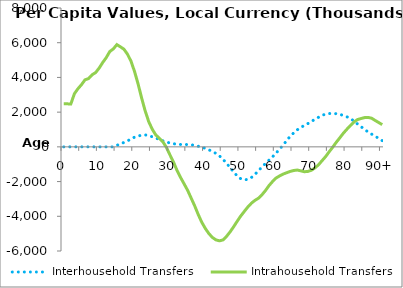
| Category | Interhousehold Transfers | Intrahousehold Transfers |
|---|---|---|
| 0 | 0 | 2479371.096 |
|  | 0 | 2476924.844 |
| 2 | 0 | 2473630.571 |
| 3 | 0 | 3059998.738 |
| 4 | 0 | 3347573.43 |
| 5 | 0 | 3581527.793 |
| 6 | 0 | 3860391.77 |
| 7 | 0 | 3932846.867 |
| 8 | 0 | 4151466.657 |
| 9 | 0 | 4279761.916 |
| 10 | 0 | 4538148.607 |
| 11 | 0 | 4857187.572 |
| 12 | 0 | 5139541.848 |
| 13 | 0 | 5490617.365 |
| 14 | 0 | 5643492.881 |
| 15 | 90722.41 | 5890176.488 |
| 16 | 160031.551 | 5763782.123 |
| 17 | 256141.92 | 5625981.125 |
| 18 | 343565.933 | 5340204.562 |
| 19 | 454004.797 | 4934194.831 |
| 20 | 558199.87 | 4341520.92 |
| 21 | 625277.721 | 3627402.817 |
| 22 | 670243.825 | 2819150.428 |
| 23 | 687757.653 | 2073214.287 |
| 24 | 649062.646 | 1456328.778 |
| 25 | 579011.338 | 1017542.77 |
| 26 | 506995.549 | 687680.511 |
| 27 | 428730.367 | 493853.991 |
| 28 | 346428.437 | 293736.442 |
| 29 | 276178.917 | -27857.112 |
| 30 | 223622.768 | -459732.258 |
| 31 | 183681.689 | -873627.657 |
| 32 | 145596.92 | -1354377.956 |
| 33 | 137260.264 | -1760097.844 |
| 34 | 141946.732 | -2129116.284 |
| 35 | 130977.022 | -2504586.74 |
| 36 | 119996.736 | -2950421.203 |
| 37 | 86779.723 | -3398948.605 |
| 38 | 33605.527 | -3897787.901 |
| 39 | -21348.29 | -4344660.185 |
| 40 | -82244.205 | -4701464.815 |
| 41 | -173182.72 | -4993687.088 |
| 42 | -262587.609 | -5219484.433 |
| 43 | -378758.688 | -5358471.869 |
| 44 | -521438.64 | -5413482.034 |
| 45 | -712932.328 | -5361709.464 |
| 46 | -945438.832 | -5156148.295 |
| 47 | -1198250.839 | -4900251.585 |
| 48 | -1439984.107 | -4604875.756 |
| 49 | -1677449.298 | -4290417.512 |
| 50 | -1835423.324 | -3988854.659 |
| 51 | -1900651.95 | -3725248.982 |
| 52 | -1876556.556 | -3468060.534 |
| 53 | -1769989.435 | -3252394.115 |
| 54 | -1594654.682 | -3086246.503 |
| 55 | -1373167.314 | -2961110.241 |
| 56 | -1165918.022 | -2763679.176 |
| 57 | -954459.582 | -2517441.599 |
| 58 | -764901.728 | -2232616.909 |
| 59 | -572245.251 | -1997121.369 |
| 60 | -359548.039 | -1795087.083 |
| 61 | -128782.19 | -1673602.28 |
| 62 | 103921.174 | -1568079.946 |
| 63 | 362268.079 | -1490838.893 |
| 64 | 612503.394 | -1414209.186 |
| 65 | 806135.709 | -1361427.947 |
| 66 | 983896.707 | -1335517.212 |
| 67 | 1125630.429 | -1382194.005 |
| 68 | 1230890.669 | -1431995.941 |
| 69 | 1339742.779 | -1416479.729 |
| 70 | 1474317.58 | -1346218.858 |
| 71 | 1582623.448 | -1209230.797 |
| 72 | 1705542.836 | -1032224.85 |
| 73 | 1814198.052 | -795490.214 |
| 74 | 1888725.597 | -563235.814 |
| 75 | 1919221.276 | -285043.551 |
| 76 | 1925051.255 | -20250.18 |
| 77 | 1910517.333 | 259960.118 |
| 78 | 1873719.177 | 517806.901 |
| 79 | 1811066.683 | 783171.76 |
| 80 | 1734508.62 | 1011949.483 |
| 81 | 1636691.938 | 1230990.202 |
| 82 | 1485730.496 | 1428632.86 |
| 83 | 1319682.925 | 1570821.828 |
| 84 | 1165583.254 | 1631695.439 |
| 85 | 1005396.4 | 1685480.809 |
| 86 | 856495.693 | 1696305.331 |
| 87 | 733399.167 | 1649997.467 |
| 88 | 613309.599 | 1521539.081 |
| 89 | 485495.851 | 1401015.186 |
| 90+ | 357682.103 | 1280494.479 |